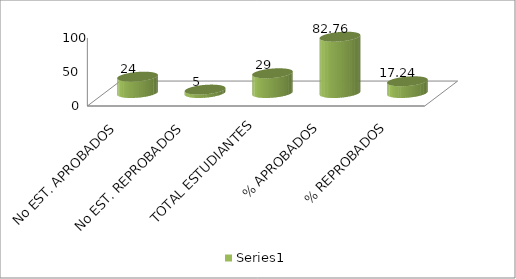
| Category | Series 0 |
|---|---|
| No EST. APROBADOS | 24 |
| No EST. REPROBADOS | 5 |
| TOTAL ESTUDIANTES | 29 |
| % APROBADOS | 82.759 |
| % REPROBADOS | 17.241 |